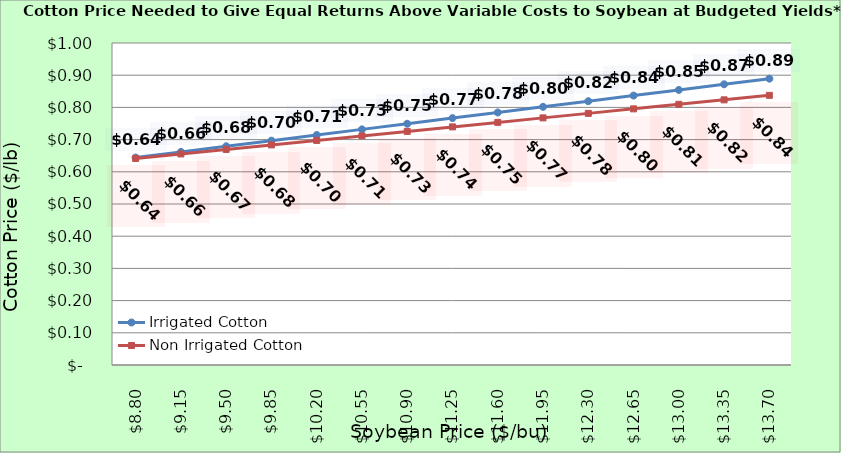
| Category | Irrigated Cotton | Non Irrigated Cotton |
|---|---|---|
| 8.800000000000002 | 0.644 | 0.641 |
| 9.150000000000002 | 0.662 | 0.655 |
| 9.500000000000002 | 0.679 | 0.669 |
| 9.850000000000001 | 0.697 | 0.683 |
| 10.200000000000001 | 0.714 | 0.697 |
| 10.55 | 0.732 | 0.711 |
| 10.9 | 0.749 | 0.725 |
| 11.25 | 0.767 | 0.739 |
| 11.6 | 0.784 | 0.753 |
| 11.95 | 0.802 | 0.767 |
| 12.299999999999999 | 0.819 | 0.781 |
| 12.649999999999999 | 0.837 | 0.795 |
| 12.999999999999998 | 0.854 | 0.809 |
| 13.349999999999998 | 0.872 | 0.823 |
| 13.699999999999998 | 0.889 | 0.837 |